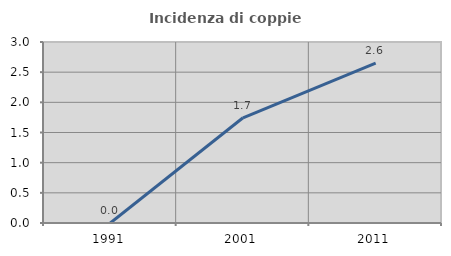
| Category | Incidenza di coppie miste |
|---|---|
| 1991.0 | 0 |
| 2001.0 | 1.744 |
| 2011.0 | 2.649 |